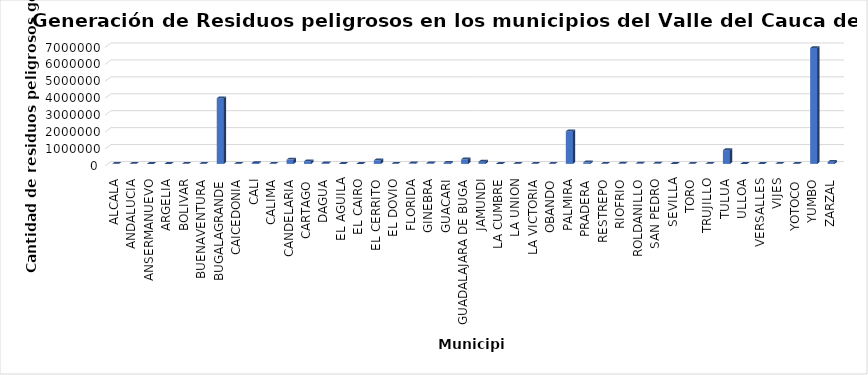
| Category | Series 0 |
|---|---|
| ALCALA | 2791 |
| ANDALUCIA | 3771.44 |
| ANSERMANUEVO | 827.13 |
| ARGELIA | 1064.9 |
| BOLIVAR | 2054.55 |
| BUENAVENTURA | 8868.7 |
| BUGALAGRANDE | 3881102.32 |
| CAICEDONIA | 9521.7 |
| CALI | 52760.16 |
| CALIMA | 3508.6 |
| CANDELARIA | 253477.88 |
| CARTAGO | 154142.68 |
| DAGUA | 42129.55 |
| EL AGUILA | 965 |
| EL CAIRO | 919.38 |
| EL CERRITO | 212470.45 |
| EL DOVIO | 1851 |
| FLORIDA | 33137.85 |
| GINEBRA | 35321.25 |
| GUACARI | 69256.6 |
| GUADALAJARA DE BUGA | 272310.56 |
| JAMUNDI | 131915.93 |
| LA CUMBRE | 499 |
| LA UNION | 12554.67 |
| LA VICTORIA | 4118.2 |
| OBANDO | 3740 |
| PALMIRA | 1930844.2 |
| PRADERA | 94587.18 |
| RESTREPO | 3292.3 |
| RIOFRIO | 24013.65 |
| ROLDANILLO | 19134.3 |
| SAN PEDRO | 20310.51 |
| SEVILLA | 1572.9 |
| TORO | 1780.8 |
| TRUJILLO | 6118.9 |
| TULUA | 811592.86 |
| ULLOA | 860.23 |
| VERSALLES | 1628.54 |
| VIJES | 3828.66 |
| YOTOCO | 12736.4 |
| YUMBO | 6846438.3 |
| ZARZAL | 120186.99 |